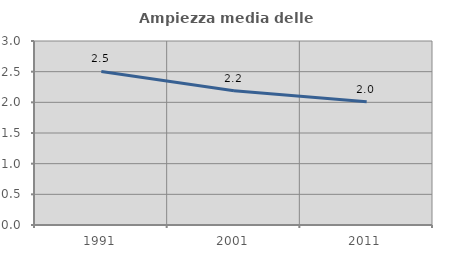
| Category | Ampiezza media delle famiglie |
|---|---|
| 1991.0 | 2.504 |
| 2001.0 | 2.19 |
| 2011.0 | 2.01 |